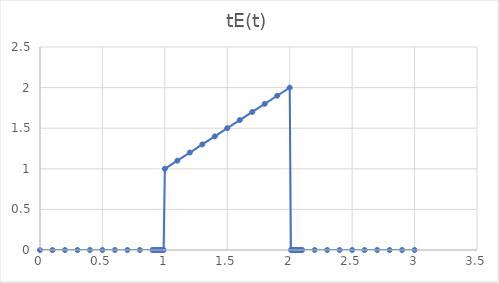
| Category | Series 0 |
|---|---|
| 0.0 | 0 |
| 0.1 | 0 |
| 0.2 | 0 |
| 0.3 | 0 |
| 0.4 | 0 |
| 0.5 | 0 |
| 0.6 | 0 |
| 0.7 | 0 |
| 0.8 | 0 |
| 0.9 | 0 |
| 0.91 | 0 |
| 0.92 | 0 |
| 0.93 | 0 |
| 0.94 | 0 |
| 0.95 | 0 |
| 0.96 | 0 |
| 0.97 | 0 |
| 0.98 | 0 |
| 0.99 | 0 |
| 1.0 | 1 |
| 1.1 | 1.1 |
| 1.2 | 1.2 |
| 1.3 | 1.3 |
| 1.4 | 1.4 |
| 1.5 | 1.5 |
| 1.6 | 1.6 |
| 1.7 | 1.7 |
| 1.8 | 1.8 |
| 1.9 | 1.9 |
| 2.0 | 2 |
| 2.01 | 0 |
| 2.02 | 0 |
| 2.03 | 0 |
| 2.04 | 0 |
| 2.05 | 0 |
| 2.06 | 0 |
| 2.07 | 0 |
| 2.08 | 0 |
| 2.09 | 0 |
| 2.1 | 0 |
| 2.2 | 0 |
| 2.3 | 0 |
| 2.4 | 0 |
| 2.5 | 0 |
| 2.6 | 0 |
| 2.7 | 0 |
| 2.8 | 0 |
| 2.9 | 0 |
| 3.0 | 0 |